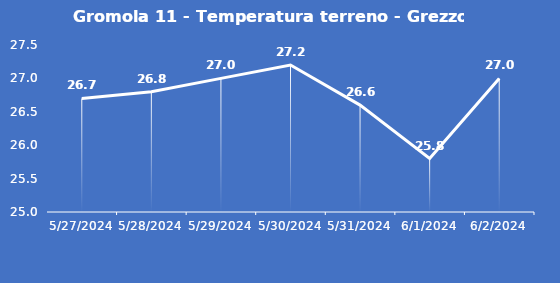
| Category | Gromola 11 - Temperatura terreno - Grezzo (°C) |
|---|---|
| 5/27/24 | 26.7 |
| 5/28/24 | 26.8 |
| 5/29/24 | 27 |
| 5/30/24 | 27.2 |
| 5/31/24 | 26.6 |
| 6/1/24 | 25.8 |
| 6/2/24 | 27 |